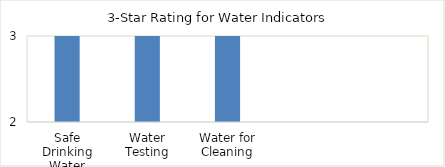
| Category | Series 0 |
|---|---|
| Safe Drinking Water | 3 |
| Water Testing | 3 |
| Water for Cleaning | 3 |